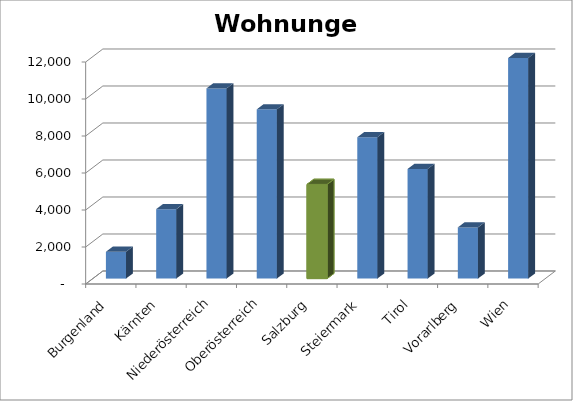
| Category | Anzahl |
|---|---|
| Burgenland | 1450 |
| Kärnten | 3755 |
| Niederösterreich | 10282 |
| Oberösterreich | 9148 |
| Salzburg | 5093 |
| Steiermark | 7641 |
| Tirol | 5925 |
| Vorarlberg | 2769 |
| Wien | 11921 |